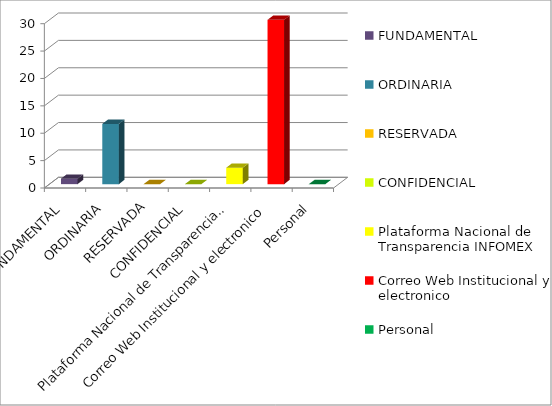
| Category | Series 2 |
|---|---|
| FUNDAMENTAL | 1 |
| ORDINARIA | 11 |
| RESERVADA | 0 |
| CONFIDENCIAL | 0 |
| Plataforma Nacional de Transparencia INFOMEX | 3 |
| Correo Web Institucional y electronico | 30 |
| Personal | 0 |